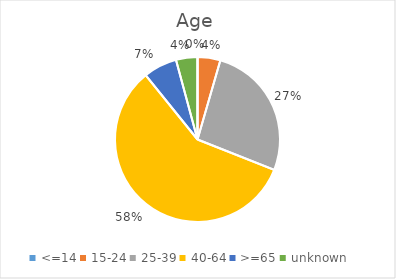
| Category | Age |
|---|---|
| <=14 | 0 |
| 15-24 | 0.045 |
| 25-39 | 0.265 |
| 40-64 | 0.582 |
| >=65 | 0.066 |
| unknown | 0.042 |